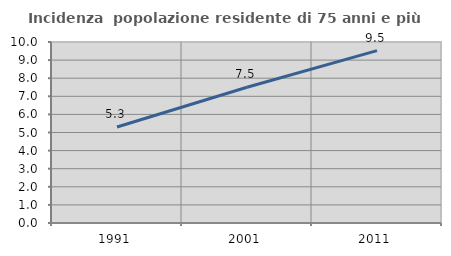
| Category | Incidenza  popolazione residente di 75 anni e più |
|---|---|
| 1991.0 | 5.306 |
| 2001.0 | 7.499 |
| 2011.0 | 9.521 |